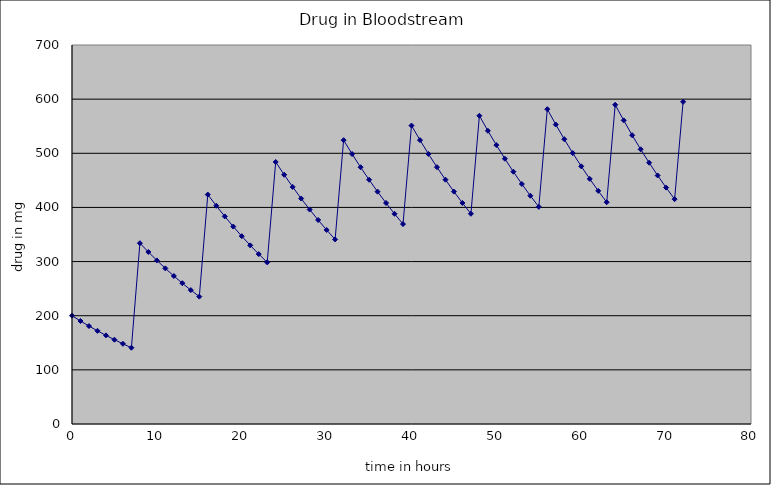
| Category | Series 0 |
|---|---|
| 0.0 | 200 |
| 1.0 | 190.235 |
| 2.0 | 180.946 |
| 3.0 | 172.111 |
| 4.0 | 163.707 |
| 5.0 | 155.714 |
| 6.0 | 148.111 |
| 7.0 | 140.879 |
| 8.0 | 334 |
| 9.0 | 317.692 |
| 10.0 | 302.18 |
| 11.0 | 287.426 |
| 12.0 | 273.392 |
| 13.0 | 260.043 |
| 14.0 | 247.346 |
| 15.0 | 235.268 |
| 16.0 | 423.781 |
| 17.0 | 403.089 |
| 18.0 | 383.407 |
| 19.0 | 364.687 |
| 20.0 | 346.88 |
| 21.0 | 329.943 |
| 22.0 | 313.833 |
| 23.0 | 298.509 |
| 24.0 | 483.934 |
| 25.0 | 460.305 |
| 26.0 | 437.83 |
| 27.0 | 416.452 |
| 28.0 | 396.118 |
| 29.0 | 376.776 |
| 30.0 | 358.38 |
| 31.0 | 340.881 |
| 32.0 | 524.237 |
| 33.0 | 498.64 |
| 34.0 | 474.293 |
| 35.0 | 451.135 |
| 36.0 | 429.107 |
| 37.0 | 408.155 |
| 38.0 | 388.226 |
| 39.0 | 369.27 |
| 40.0 | 551.24 |
| 41.0 | 524.324 |
| 42.0 | 498.723 |
| 43.0 | 474.372 |
| 44.0 | 451.21 |
| 45.0 | 429.179 |
| 46.0 | 408.223 |
| 47.0 | 388.291 |
| 48.0 | 569.332 |
| 49.0 | 541.533 |
| 50.0 | 515.092 |
| 51.0 | 489.941 |
| 52.0 | 466.019 |
| 53.0 | 443.265 |
| 54.0 | 421.621 |
| 55.0 | 401.035 |
| 56.0 | 581.453 |
| 57.0 | 553.063 |
| 58.0 | 526.058 |
| 59.0 | 500.373 |
| 60.0 | 475.941 |
| 61.0 | 452.702 |
| 62.0 | 430.598 |
| 63.0 | 409.573 |
| 64.0 | 589.575 |
| 65.0 | 560.788 |
| 66.0 | 533.406 |
| 67.0 | 507.362 |
| 68.0 | 482.589 |
| 69.0 | 459.025 |
| 70.0 | 436.612 |
| 71.0 | 415.294 |
| 72.0 | 595.016 |